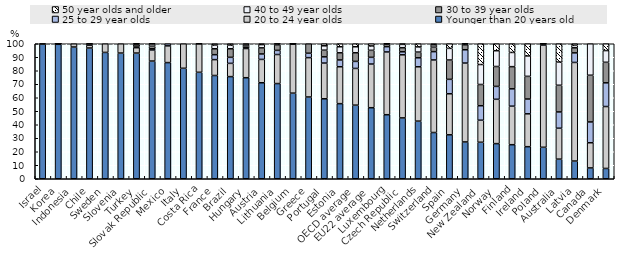
| Category | Younger than 20 years old | 20 to 24 year olds | 25 to 29 year olds | 30 to 39 year olds | 40 to 49 year olds | 50 year olds and older |
|---|---|---|---|---|---|---|
| Israel | 99.801 | 0.199 | 0 | 0 | 0 | 0 |
| Korea | 99.595 | 0.383 | 0.007 | 0.001 | 0.014 | 0 |
| Indonesia | 97.589 | 2.411 | 0 | 0 | 0 | 0 |
| Chile | 96.851 | 2.036 | 0.308 | 0.426 | 0.268 | 0.112 |
| Sweden | 93.58 | 6.42 | 0 | 0 | 0 | 0 |
| Slovenia | 93.103 | 6.897 | 0 | 0 | 0 | 0 |
| Turkey | 93.091 | 3.988 | 1.092 | 1.373 | 0.396 | 0.06 |
| Slovak Republic | 87.186 | 8.196 | 0.946 | 1.877 | 1.757 | 0.039 |
| Mexico | 86.045 | 12.385 | 1.57 | 0 | 0 | 0 |
| Italy | 81.83 | 18.17 | 0 | 0 | 0 | 0 |
| Costa Rica | 78.859 | 21.121 | 0.019 | 0 | 0 | 0 |
| France | 76.482 | 11.762 | 3.655 | 4.383 | 2.756 | 0.962 |
| Brazil | 75.656 | 9.82 | 4.475 | 6.349 | 2.691 | 1.009 |
| Hungary | 74.844 | 21.618 | 0.536 | 1.314 | 1.208 | 0.481 |
| Austria | 71.11 | 17.285 | 4.04 | 4.52 | 2.413 | 0.632 |
| Lithuania | 70.52 | 21.511 | 3.062 | 4.102 | 0.648 | 0.157 |
| Belgium | 63.406 | 36.296 | 0.256 | 0.031 | 0.011 | 0 |
| Greece | 60.559 | 29.154 | 3.27 | 7.016 | 0 | 0 |
| Portugal | 59.247 | 26.442 | 4.632 | 4.923 | 3.243 | 1.513 |
| Estonia | 55.634 | 27.337 | 5.027 | 5.309 | 4.462 | 2.231 |
| OECD average | 54.525 | 27.19 | 5.206 | 6.419 | 4.43 | 2.23 |
| EU22 average | 52.621 | 32.354 | 4.976 | 5.192 | 3.238 | 1.619 |
| Luxembourg | 47.438 | 46.494 | 3.911 | 1.753 | 0.371 | 0.034 |
| Czech Republic | 45.074 | 46.741 | 2.23 | 3.014 | 2.48 | 0.459 |
| Netherlands | 42.685 | 40.263 | 6.653 | 4.234 | 3.842 | 2.323 |
| Switzerland | 34.248 | 53.752 | 6.158 | 3.337 | 1.684 | 0.82 |
| Spain | 32.554 | 30.397 | 10.683 | 14.33 | 8.63 | 3.406 |
| Germany | 27.26 | 58.443 | 9.843 | 3.736 | 0.615 | 0.103 |
| New Zealand | 27.034 | 16.323 | 10.737 | 15.737 | 14.78 | 15.389 |
| Norway | 26.028 | 32.834 | 9.541 | 14.746 | 11.695 | 5.155 |
| Finland | 25.229 | 28.534 | 12.851 | 16.424 | 10.518 | 6.443 |
| Ireland | 23.751 | 24.35 | 10.957 | 16.79 | 15.087 | 9.066 |
| Poland | 23.316 | 75.728 | 0.366 | 0.409 | 0.12 | 0.06 |
| Australia | 14.536 | 22.901 | 12.06 | 19.755 | 17.161 | 13.587 |
| Latvia | 13.121 | 73.034 | 7.086 | 3.759 | 1.81 | 1.19 |
| Canada | 8.012 | 18.663 | 15.409 | 34.597 | 23.318 | 0 |
| Denmark | 7.631 | 45.874 | 17.559 | 15.203 | 8.677 | 5.056 |